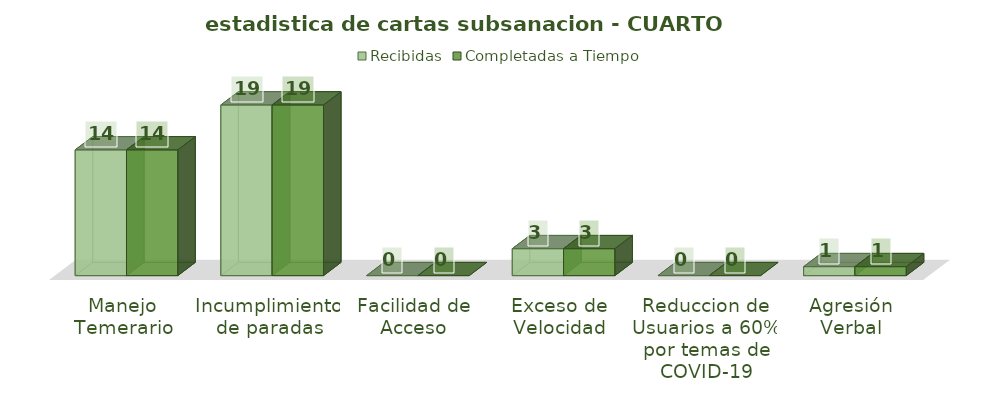
| Category | Recibidas | Completadas a Tiempo |
|---|---|---|
| Manejo Temerario | 14 | 14 |
| Incumplimiento de paradas | 19 | 19 |
| Facilidad de Acceso | 0 | 0 |
| Exceso de Velocidad | 3 | 3 |
| Reduccion de Usuarios a 60% por temas de COVID-19 | 0 | 0 |
| Agresión Verbal | 1 | 1 |